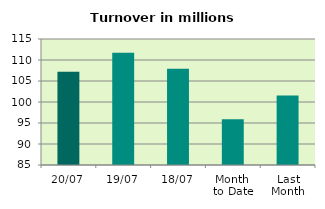
| Category | Series 0 |
|---|---|
| 20/07 | 107.189 |
| 19/07 | 111.724 |
| 18/07 | 107.887 |
| Month 
to Date | 95.876 |
| Last
Month | 101.544 |